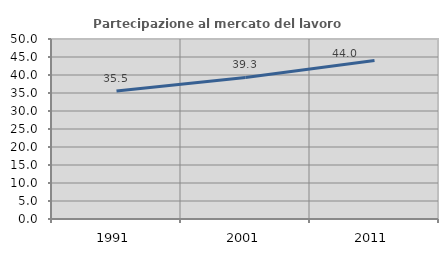
| Category | Partecipazione al mercato del lavoro  femminile |
|---|---|
| 1991.0 | 35.544 |
| 2001.0 | 39.309 |
| 2011.0 | 44.029 |